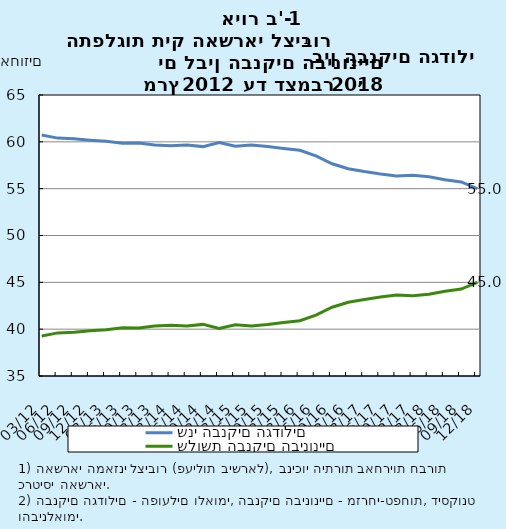
| Category | שני הבנקים הגדולים | שלושת הבנקים הבינוניים  |
|---|---|---|
| 2012-03-31 | 60.727 | 39.273 |
| 2012-06-30 | 60.396 | 39.604 |
| 2012-09-30 | 60.333 | 39.667 |
| 2012-12-31 | 60.18 | 39.82 |
| 2013-03-31 | 60.058 | 39.942 |
| 2013-06-30 | 59.837 | 40.163 |
| 2013-09-30 | 59.873 | 40.127 |
| 2013-12-31 | 59.654 | 40.346 |
| 2014-03-31 | 59.575 | 40.425 |
| 2014-06-30 | 59.667 | 40.333 |
| 2014-09-30 | 59.49 | 40.51 |
| 2014-12-31 | 59.925 | 40.075 |
| 2015-03-31 | 59.535 | 40.465 |
| 2015-06-30 | 59.649 | 40.351 |
| 2015-09-30 | 59.509 | 40.491 |
| 2015-12-31 | 59.284 | 40.716 |
| 2016-03-31 | 59.094 | 40.906 |
| 2016-06-30 | 58.498 | 41.502 |
| 2016-09-30 | 57.656 | 42.344 |
| 2016-12-31 | 57.126 | 42.874 |
| 2017-03-31 | 56.824 | 43.176 |
| 2017-06-30 | 56.563 | 43.437 |
| 2017-09-30 | 56.352 | 43.648 |
| 2017-12-31 | 56.422 | 43.578 |
| 2018-03-31 | 56.262 | 43.738 |
| 2018-06-30 | 55.953 | 44.047 |
| 2018-09-30 | 55.716 | 44.284 |
| 2018-12-31 | 55.003 | 44.997 |